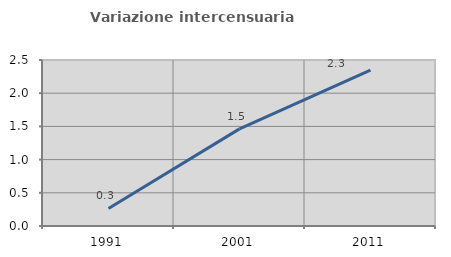
| Category | Variazione intercensuaria annua |
|---|---|
| 1991.0 | 0.264 |
| 2001.0 | 1.463 |
| 2011.0 | 2.348 |